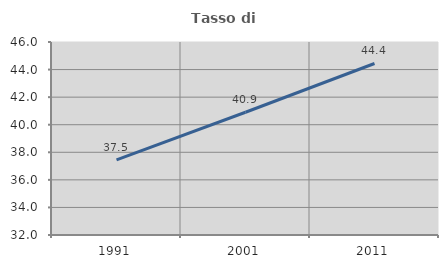
| Category | Tasso di occupazione   |
|---|---|
| 1991.0 | 37.453 |
| 2001.0 | 40.906 |
| 2011.0 | 44.441 |